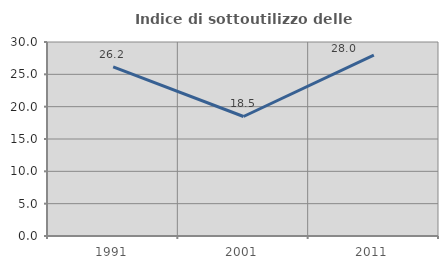
| Category | Indice di sottoutilizzo delle abitazioni  |
|---|---|
| 1991.0 | 26.168 |
| 2001.0 | 18.481 |
| 2011.0 | 27.968 |